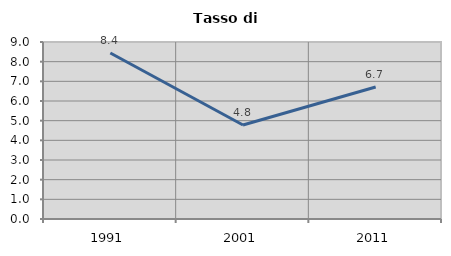
| Category | Tasso di disoccupazione   |
|---|---|
| 1991.0 | 8.442 |
| 2001.0 | 4.779 |
| 2011.0 | 6.713 |